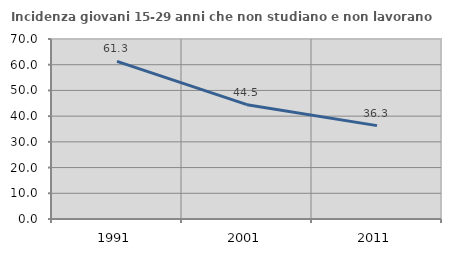
| Category | Incidenza giovani 15-29 anni che non studiano e non lavorano  |
|---|---|
| 1991.0 | 61.27 |
| 2001.0 | 44.463 |
| 2011.0 | 36.307 |